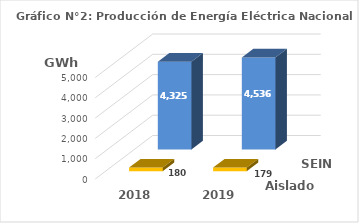
| Category | Aislados | SEIN |
|---|---|---|
| 2018.0 | 179.589 | 4324.538 |
| 2019.0 | 179.132 | 4535.735 |